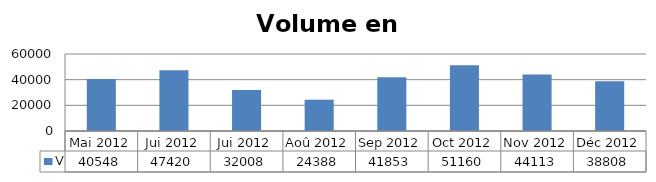
| Category | V |
|---|---|
| Mai 2012 | 40548 |
| Jui 2012 | 47420 |
| Jui 2012 | 32008 |
| Aoû 2012 | 24388 |
| Sep 2012 | 41853 |
| Oct 2012 | 51160 |
| Nov 2012 | 44113 |
| Déc 2012 | 38808 |